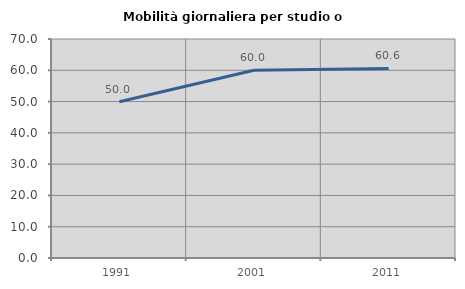
| Category | Mobilità giornaliera per studio o lavoro |
|---|---|
| 1991.0 | 49.952 |
| 2001.0 | 60.035 |
| 2011.0 | 60.574 |